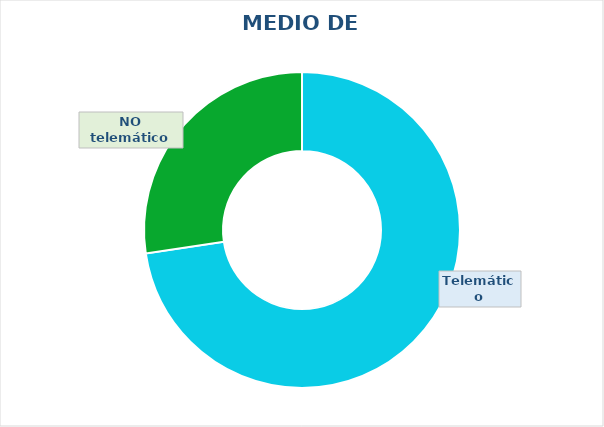
| Category | PORCENTAJE |
|---|---|
| Telemático | 0.726 |
| NO telemático | 0.274 |